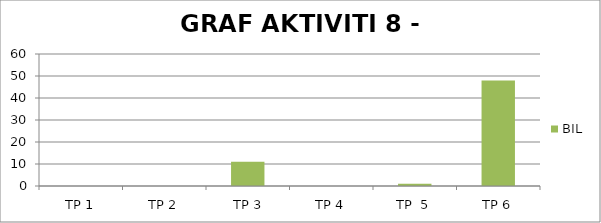
| Category | BIL |
|---|---|
| TP 1 | 0 |
| TP 2 | 0 |
|  TP 3 | 11 |
| TP 4 | 0 |
| TP  5 | 1 |
| TP 6 | 48 |